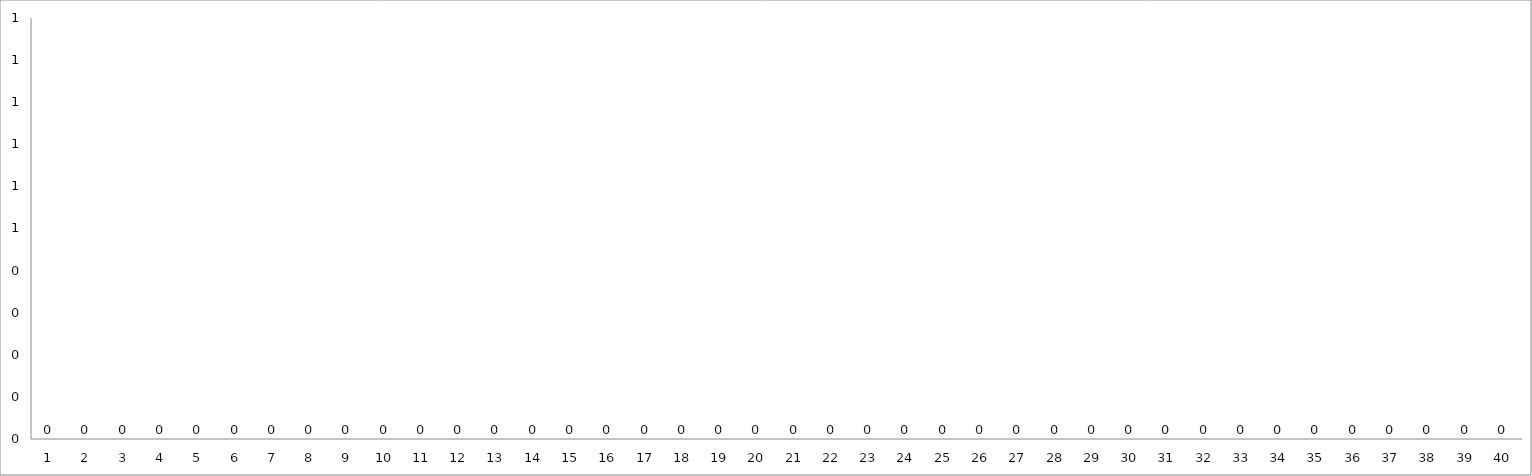
| Category | SORULARIN CEVAPLANMA YÜZDELERİ |
|---|---|
| 1.0 | 0 |
| 2.0 | 0 |
| 3.0 | 0 |
| 4.0 | 0 |
| 5.0 | 0 |
| 6.0 | 0 |
| 7.0 | 0 |
| 8.0 | 0 |
| 9.0 | 0 |
| 10.0 | 0 |
| 11.0 | 0 |
| 12.0 | 0 |
| 13.0 | 0 |
| 14.0 | 0 |
| 15.0 | 0 |
| 16.0 | 0 |
| 17.0 | 0 |
| 18.0 | 0 |
| 19.0 | 0 |
| 20.0 | 0 |
| 21.0 | 0 |
| 22.0 | 0 |
| 23.0 | 0 |
| 24.0 | 0 |
| 25.0 | 0 |
| 26.0 | 0 |
| 27.0 | 0 |
| 28.0 | 0 |
| 29.0 | 0 |
| 30.0 | 0 |
| 31.0 | 0 |
| 32.0 | 0 |
| 33.0 | 0 |
| 34.0 | 0 |
| 35.0 | 0 |
| 36.0 | 0 |
| 37.0 | 0 |
| 38.0 | 0 |
| 39.0 | 0 |
| 40.0 | 0 |